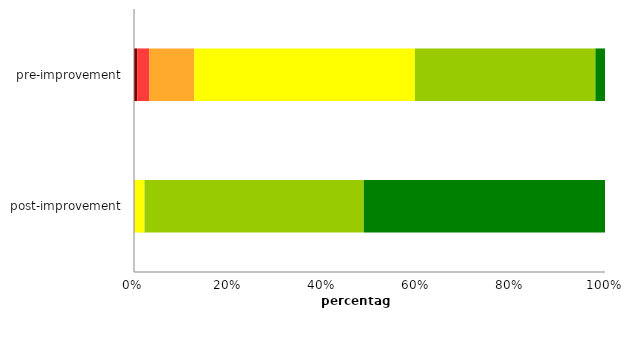
| Category | G | F | E | D | C | A/B |
|---|---|---|---|---|---|---|
| post-improvement | 0 | 0.016 | 0.107 | 2.106 | 46.552 | 51.219 |
| pre-improvement | 0.672 | 2.539 | 9.563 | 46.863 | 38.325 | 2.037 |